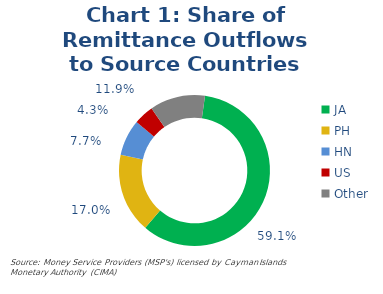
| Category | Chart 1: Share of Remittance Outflows to Source Countries 2021Q2 |
|---|---|
| JA | 0.591 |
| PH | 0.17 |
| HN | 0.077 |
| US | 0.043 |
| Other | 0.119 |